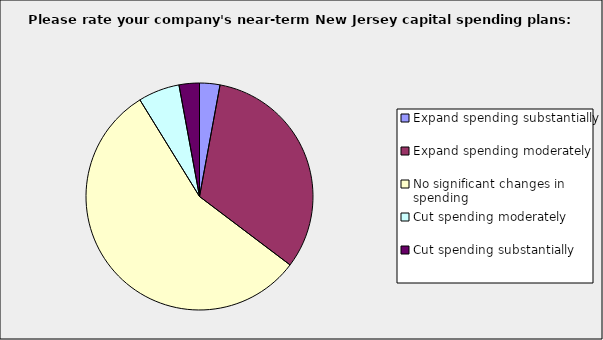
| Category | Series 0 |
|---|---|
| Expand spending substantially | 0.029 |
| Expand spending moderately | 0.324 |
| No significant changes in spending | 0.559 |
| Cut spending moderately | 0.059 |
| Cut spending substantially | 0.029 |